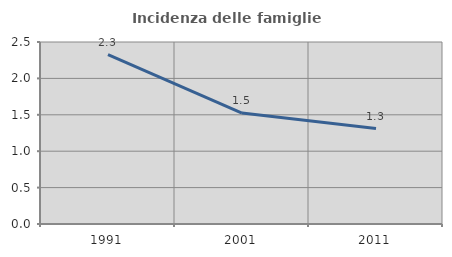
| Category | Incidenza delle famiglie numerose |
|---|---|
| 1991.0 | 2.326 |
| 2001.0 | 1.524 |
| 2011.0 | 1.311 |